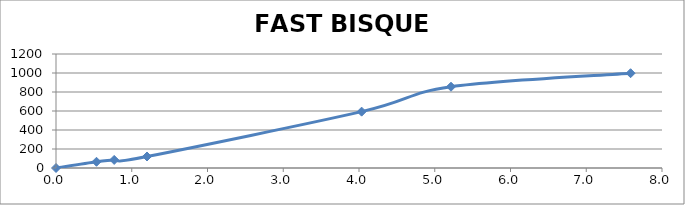
| Category | FAST BISQUE CHART |
|---|---|
| 0.0 | 0 |
| 0.534666666666667 | 65.556 |
| 0.768 | 85 |
| 1.201333333333333 | 121.111 |
| 4.034666666666666 | 593.333 |
| 5.214667666666666 | 855.556 |
| 7.585034333333333 | 997.778 |